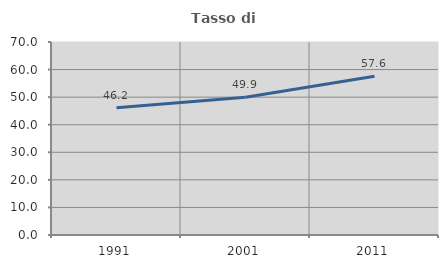
| Category | Tasso di occupazione   |
|---|---|
| 1991.0 | 46.151 |
| 2001.0 | 49.924 |
| 2011.0 | 57.551 |